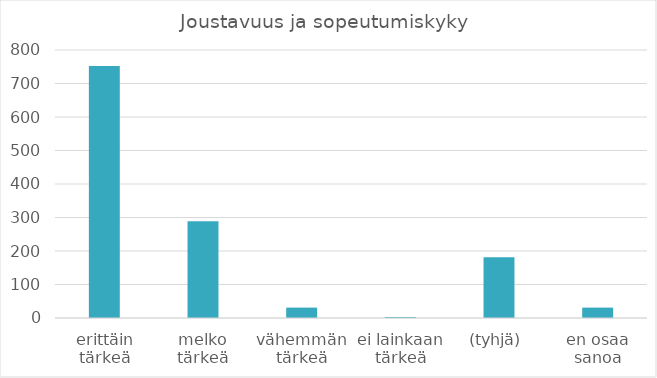
| Category | Summa |
|---|---|
| erittäin tärkeä | 752 |
| melko tärkeä | 289 |
| vähemmän tärkeä | 31 |
| ei lainkaan tärkeä | 3 |
| (tyhjä) | 181 |
| en osaa sanoa | 31 |